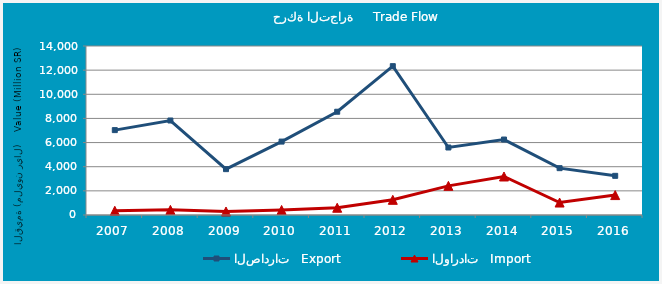
| Category | الصادرات   Export | الواردات   Import |
|---|---|---|
| 2007.0 | 7031.991 | 350.957 |
| 2008.0 | 7827.228 | 425.693 |
| 2009.0 | 3798.529 | 289.976 |
| 2010.0 | 6081.963 | 417.857 |
| 2011.0 | 8554.541 | 601.297 |
| 2012.0 | 12330.641 | 1258.086 |
| 2013.0 | 5591.189 | 2413.286 |
| 2014.0 | 6250.692 | 3189.394 |
| 2015.0 | 3879.453 | 1031.725 |
| 2016.0 | 3244.02 | 1649.496 |